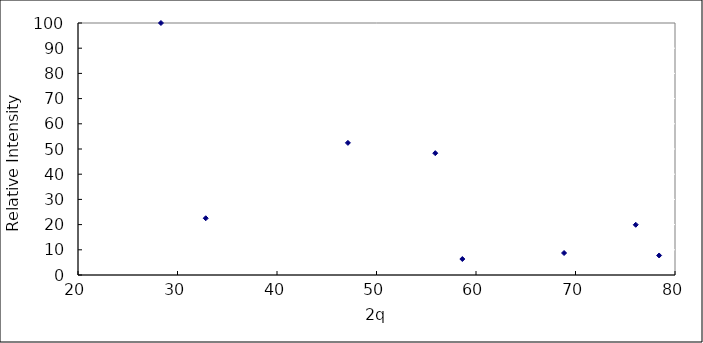
| Category | Series 0 |
|---|---|
| 28.339248259725778 | 100 |
| 32.838417984790894 | 22.519 |
| 47.12459310462792 | 52.435 |
| 55.905550946662295 | 48.341 |
| 58.626851228397875 | 6.341 |
| 68.84988165917508 | 8.726 |
| 76.05648907091283 | 19.929 |
| 78.40362522240753 | 7.749 |